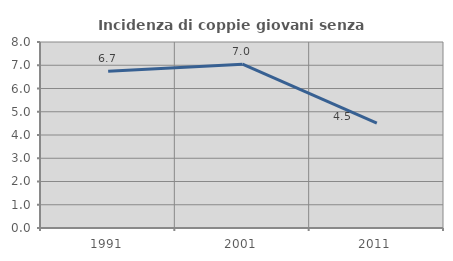
| Category | Incidenza di coppie giovani senza figli |
|---|---|
| 1991.0 | 6.74 |
| 2001.0 | 7.044 |
| 2011.0 | 4.506 |